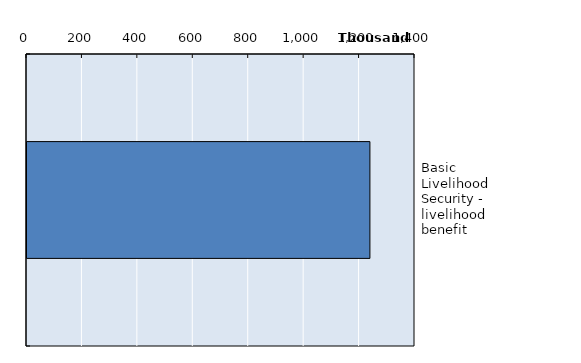
| Category | Series 0 |
|---|---|
| Basic Livelihood Security - livelihood benefit | 1237301.5 |